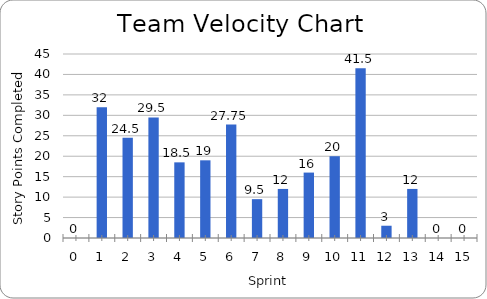
| Category | Story Points Completed |
|---|---|
| 0.0 | 0 |
| 1.0 | 32 |
| 2.0 | 24.5 |
| 3.0 | 29.5 |
| 4.0 | 18.5 |
| 5.0 | 19 |
| 6.0 | 27.75 |
| 7.0 | 9.5 |
| 8.0 | 12 |
| 9.0 | 16 |
| 10.0 | 20 |
| 11.0 | 41.5 |
| 12.0 | 3 |
| 13.0 | 12 |
| 14.0 | 0 |
| 15.0 | 0 |